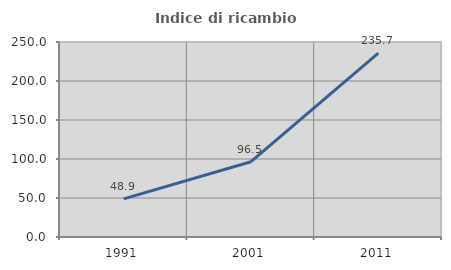
| Category | Indice di ricambio occupazionale  |
|---|---|
| 1991.0 | 48.88 |
| 2001.0 | 96.532 |
| 2011.0 | 235.693 |